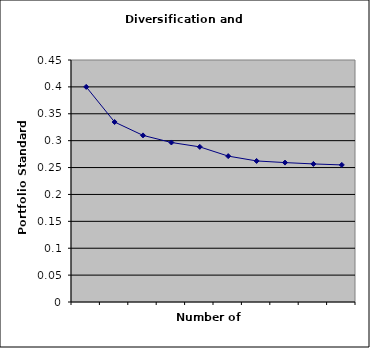
| Category | Series 1 | Series 0 |
|---|---|---|
| 0 |  | 0.4 |
| 1 |  | 0.335 |
| 2 |  | 0.31 |
| 3 |  | 0.297 |
| 4 |  | 0.288 |
| 5 |  | 0.271 |
| 6 |  | 0.262 |
| 7 |  | 0.259 |
| 8 |  | 0.257 |
| 9 |  | 0.255 |